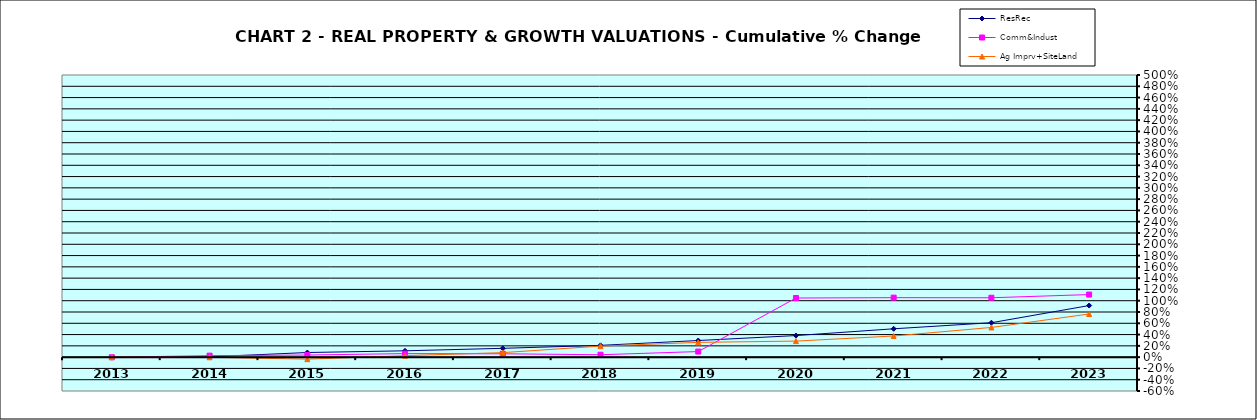
| Category | ResRec | Comm&Indust | Ag Imprv+SiteLand |
|---|---|---|---|
| 2013.0 | -0.008 | -0.001 | 0 |
| 2014.0 | 0.006 | 0.026 | -0.002 |
| 2015.0 | 0.082 | 0.038 | -0.036 |
| 2016.0 | 0.112 | 0.062 | 0.026 |
| 2017.0 | 0.156 | 0.059 | 0.08 |
| 2018.0 | 0.209 | 0.043 | 0.196 |
| 2019.0 | 0.294 | 0.099 | 0.262 |
| 2020.0 | 0.382 | 1.048 | 0.284 |
| 2021.0 | 0.502 | 1.054 | 0.375 |
| 2022.0 | 0.61 | 1.052 | 0.526 |
| 2023.0 | 0.915 | 1.109 | 0.764 |